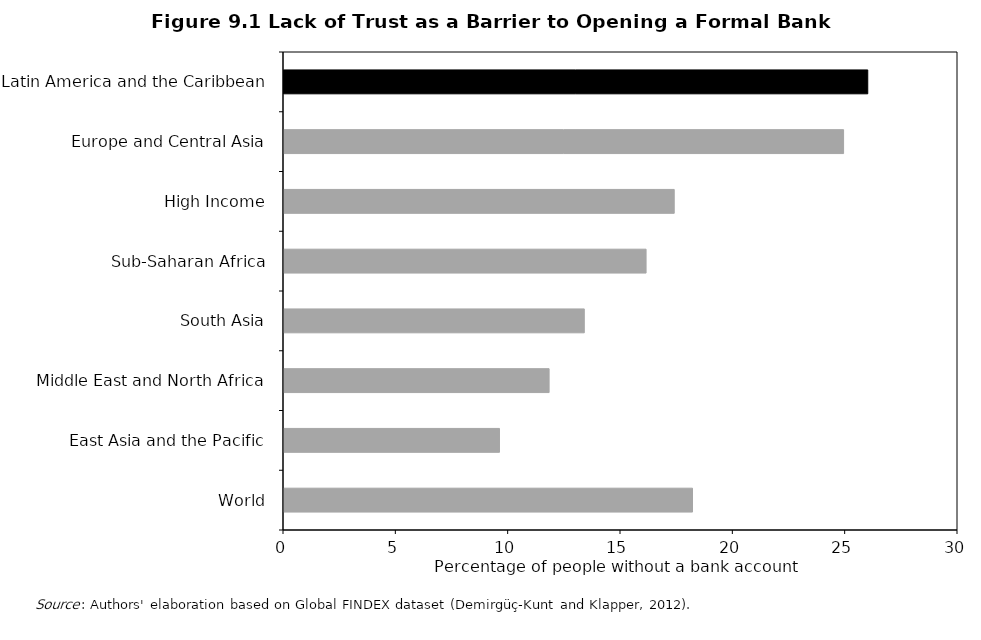
| Category | Lack of trust |
|---|---|
| World | 18.182 |
| East Asia and the Pacific | 9.591 |
| Middle East and North Africa | 11.8 |
| South Asia | 13.366 |
| Sub-Saharan Africa | 16.116 |
| High Income | 17.369 |
| Europe and Central Asia | 24.908 |
| Latin America and the Caribbean | 25.983 |